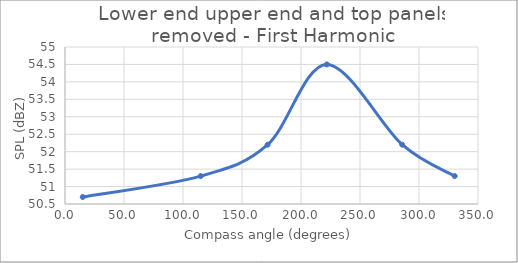
| Category | Series 0 |
|---|---|
| 15.06445125542554 | 50.7 |
| 115.00449447818254 | 51.3 |
| 171.7068171198818 | 52.2 |
| 221.8691292075067 | 54.5 |
| 285.7828166838848 | 52.2 |
| 330.28010595813004 | 51.3 |